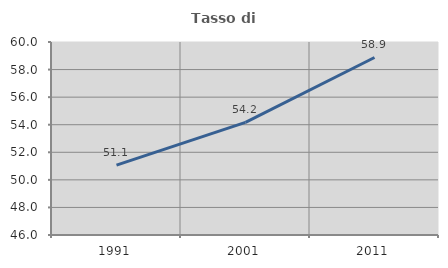
| Category | Tasso di occupazione   |
|---|---|
| 1991.0 | 51.072 |
| 2001.0 | 54.173 |
| 2011.0 | 58.878 |